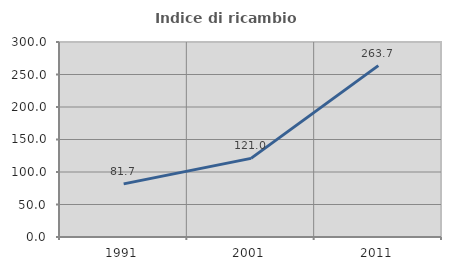
| Category | Indice di ricambio occupazionale  |
|---|---|
| 1991.0 | 81.714 |
| 2001.0 | 120.988 |
| 2011.0 | 263.71 |